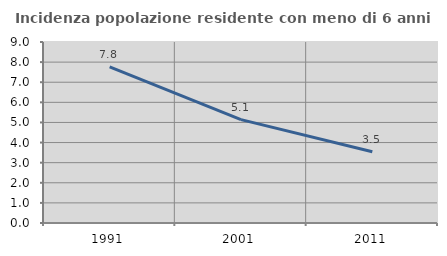
| Category | Incidenza popolazione residente con meno di 6 anni |
|---|---|
| 1991.0 | 7.763 |
| 2001.0 | 5.14 |
| 2011.0 | 3.545 |